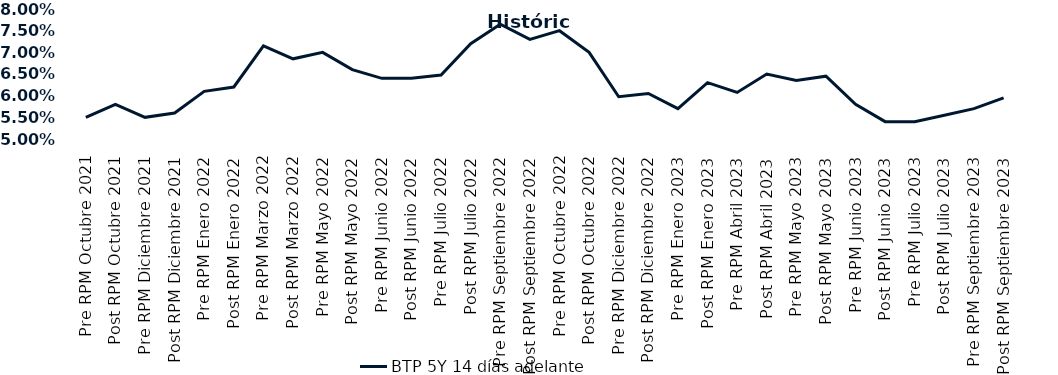
| Category | BTP 5Y 14 días adelante |
|---|---|
| Pre RPM Octubre 2021 | 0.055 |
| Post RPM Octubre 2021 | 0.058 |
| Pre RPM Diciembre 2021 | 0.055 |
| Post RPM Diciembre 2021 | 0.056 |
| Pre RPM Enero 2022 | 0.061 |
| Post RPM Enero 2022 | 0.062 |
| Pre RPM Marzo 2022 | 0.072 |
| Post RPM Marzo 2022 | 0.068 |
| Pre RPM Mayo 2022 | 0.07 |
| Post RPM Mayo 2022 | 0.066 |
| Pre RPM Junio 2022 | 0.064 |
| Post RPM Junio 2022 | 0.064 |
| Pre RPM Julio 2022 | 0.065 |
| Post RPM Julio 2022 | 0.072 |
| Pre RPM Septiembre 2022 | 0.076 |
| Post RPM Septiembre 2022 | 0.073 |
| Pre RPM Octubre 2022 | 0.075 |
| Post RPM Octubre 2022 | 0.07 |
| Pre RPM Diciembre 2022 | 0.06 |
| Post RPM Diciembre 2022 | 0.06 |
| Pre RPM Enero 2023 | 0.057 |
| Post RPM Enero 2023 | 0.063 |
| Pre RPM Abril 2023 | 0.061 |
| Post RPM Abril 2023 | 0.065 |
| Pre RPM Mayo 2023 | 0.064 |
| Post RPM Mayo 2023 | 0.064 |
| Pre RPM Junio 2023 | 0.058 |
| Post RPM Junio 2023 | 0.054 |
| Pre RPM Julio 2023 | 0.054 |
| Post RPM Julio 2023 | 0.056 |
| Pre RPM Septiembre 2023 | 0.057 |
| Post RPM Septiembre 2023 | 0.06 |